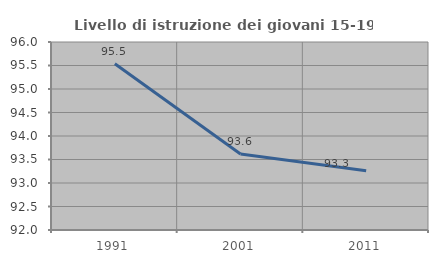
| Category | Livello di istruzione dei giovani 15-19 anni |
|---|---|
| 1991.0 | 95.536 |
| 2001.0 | 93.617 |
| 2011.0 | 93.258 |